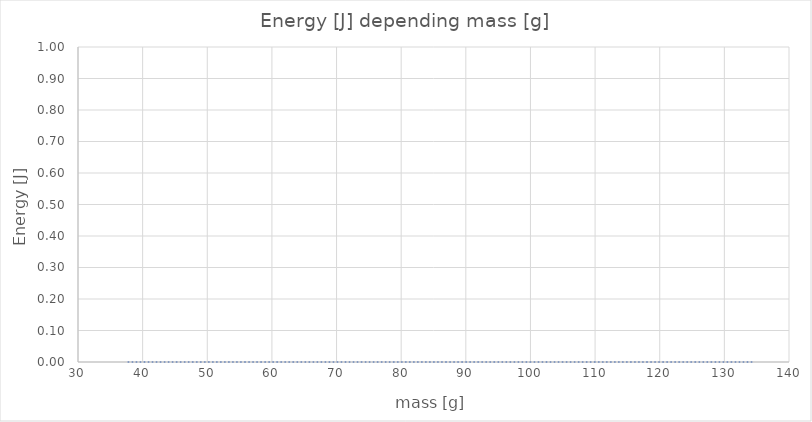
| Category | energy [J] |
|---|---|
| 37.8 | 0 |
| 46.0 | 0 |
| 54.199999999999996 | 0 |
| 62.0 | 0 |
| 62.39999999999999 | 0 |
| 70.2 | 0 |
| 70.6 | 0 |
| 78.4 | 0 |
| 86.19999999999999 | 0 |
| 86.6 | 0 |
| 94.39999999999999 | 0 |
| 102.6 | 0 |
| 110.39999999999999 | 0 |
| 118.6 | 0 |
| 134.6 | 0 |